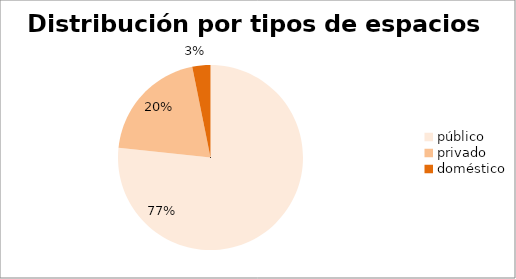
| Category | e.interiores |
|---|---|
| público | 460 |
| privado | 121 |
| doméstico | 19 |